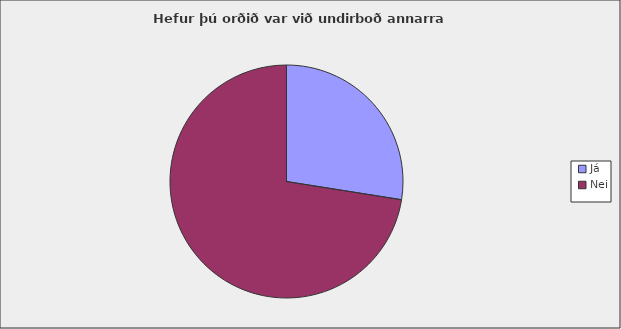
| Category | Series 0 |
|---|---|
| Já | 0.275 |
| Nei | 0.725 |